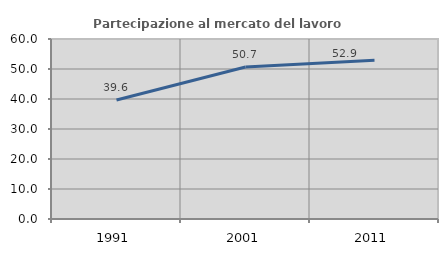
| Category | Partecipazione al mercato del lavoro  femminile |
|---|---|
| 1991.0 | 39.642 |
| 2001.0 | 50.681 |
| 2011.0 | 52.904 |